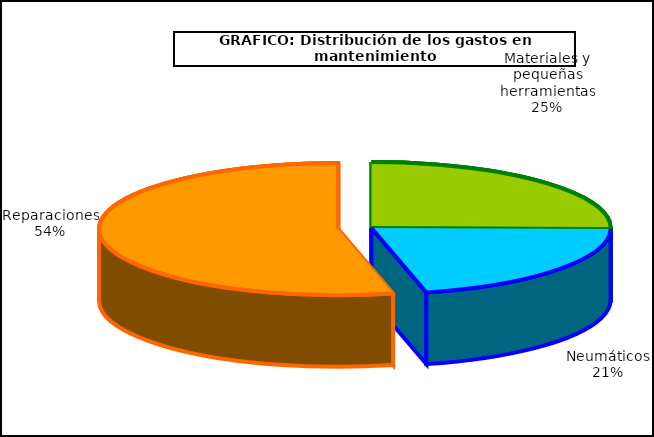
| Category | Series 0 |
|---|---|
| 0 | 381.76 |
| 1 | 319.732 |
| 2 | 813.151 |